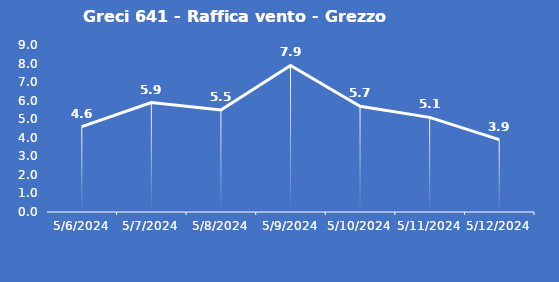
| Category | Greci 641 - Raffica vento - Grezzo (m/s) |
|---|---|
| 5/6/24 | 4.6 |
| 5/7/24 | 5.9 |
| 5/8/24 | 5.5 |
| 5/9/24 | 7.9 |
| 5/10/24 | 5.7 |
| 5/11/24 | 5.1 |
| 5/12/24 | 3.9 |